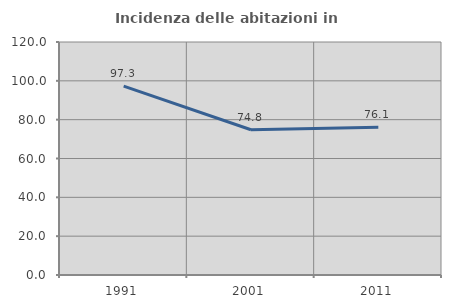
| Category | Incidenza delle abitazioni in proprietà  |
|---|---|
| 1991.0 | 97.255 |
| 2001.0 | 74.803 |
| 2011.0 | 76.062 |